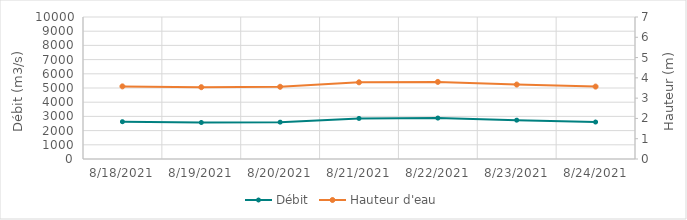
| Category | Débit |
|---|---|
| 6/6/21 | 7487.85 |
| 6/5/21 | 7529.57 |
| 6/4/21 | 7183.33 |
| 6/3/21 | 6742.99 |
| 6/2/21 | 6459.87 |
| 6/1/21 | 6462.29 |
| 5/31/21 | 6483.05 |